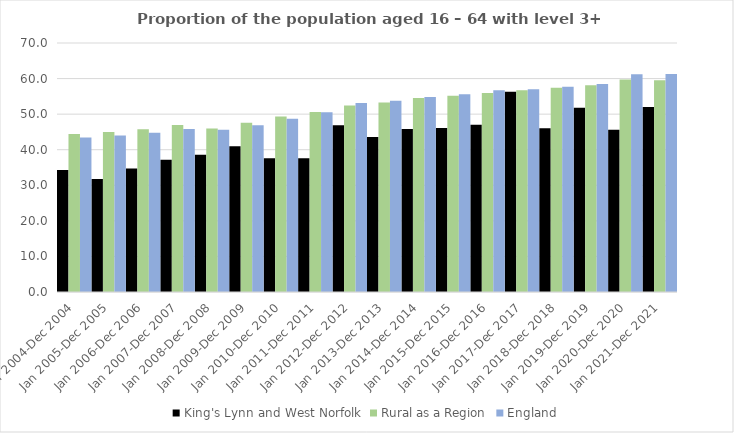
| Category | King's Lynn and West Norfolk | Rural as a Region | England |
|---|---|---|---|
| Jan 2004-Dec 2004 | 34.3 | 44.405 | 43.4 |
| Jan 2005-Dec 2005 | 31.8 | 44.973 | 44 |
| Jan 2006-Dec 2006 | 34.7 | 45.774 | 44.8 |
| Jan 2007-Dec 2007 | 37.2 | 46.968 | 45.8 |
| Jan 2008-Dec 2008 | 38.6 | 45.964 | 45.6 |
| Jan 2009-Dec 2009 | 41 | 47.59 | 46.9 |
| Jan 2010-Dec 2010 | 37.6 | 49.362 | 48.7 |
| Jan 2011-Dec 2011 | 37.6 | 50.602 | 50.5 |
| Jan 2012-Dec 2012 | 46.9 | 52.439 | 53.1 |
| Jan 2013-Dec 2013 | 43.6 | 53.276 | 53.8 |
| Jan 2014-Dec 2014 | 45.8 | 54.57 | 54.8 |
| Jan 2015-Dec 2015 | 46.1 | 55.16 | 55.6 |
| Jan 2016-Dec 2016 | 47 | 55.941 | 56.7 |
| Jan 2017-Dec 2017 | 56.3 | 56.689 | 57 |
| Jan 2018-Dec 2018 | 46 | 57.389 | 57.7 |
| Jan 2019-Dec 2019 | 51.8 | 58.147 | 58.5 |
| Jan 2020-Dec 2020 | 45.6 | 59.771 | 61.2 |
| Jan 2021-Dec 2021 | 52 | 59.54 | 61.3 |